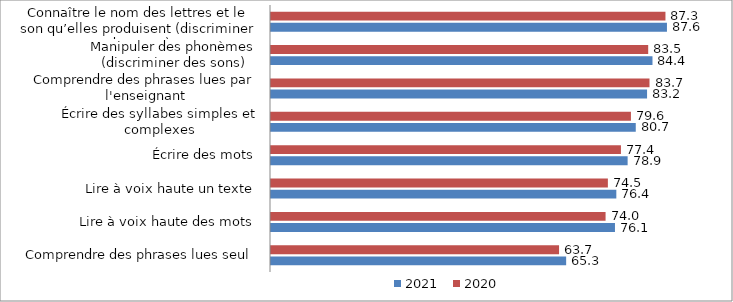
| Category | 2021 | 2020 |
|---|---|---|
| Comprendre des phrases lues seul | 65.3 | 63.73 |
| Lire à voix haute des mots | 76.1 | 74.02 |
| Lire à voix haute un texte | 76.4 | 74.53 |
| Écrire des mots | 78.9 | 77.42 |
| Écrire des syllabes simples et complexes | 80.7 | 79.63 |
| Comprendre des phrases lues par l'enseignant | 83.2 | 83.74 |
| Manipuler des phonèmes (discriminer des sons) | 84.4 | 83.45 |
| Connaître le nom des lettres et le son qu’elles produisent (discriminer des sons) | 87.6 | 87.27 |